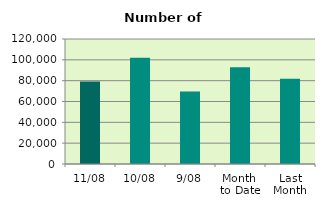
| Category | Series 0 |
|---|---|
| 11/08 | 79306 |
| 10/08 | 102000 |
| 9/08 | 69542 |
| Month 
to Date | 92995.111 |
| Last
Month | 81818 |